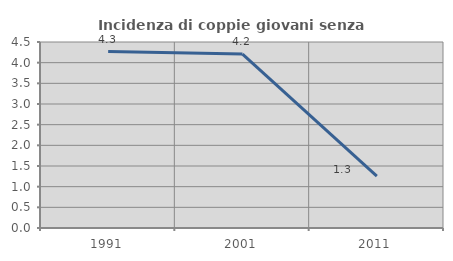
| Category | Incidenza di coppie giovani senza figli |
|---|---|
| 1991.0 | 4.268 |
| 2001.0 | 4.207 |
| 2011.0 | 1.254 |